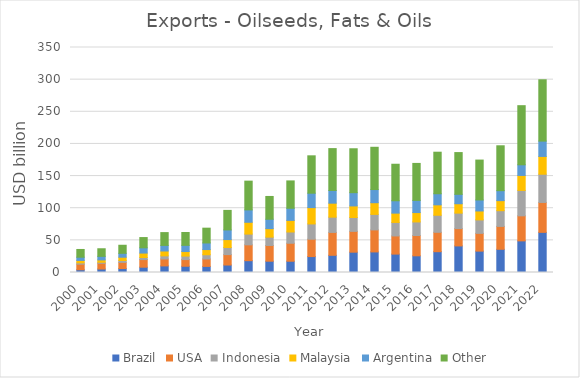
| Category | Brazil | USA | Indonesia | Malaysia | Argentina | Other  |
|---|---|---|---|---|---|---|
| 2000.0 | 4313.46 | 8647.464 | 1991.258 | 3811.366 | 5017.016 | 12046.791 |
| 2001.0 | 5423.744 | 8865.923 | 1622.854 | 3634.511 | 5551.077 | 11828.121 |
| 2002.0 | 6127.06 | 9622.836 | 2878.549 | 5140.683 | 6038.408 | 12564.76 |
| 2003.0 | 8254.503 | 11869.117 | 3233.716 | 6878.37 | 8181.266 | 15932.516 |
| 2004.0 | 10263.632 | 10770.296 | 4851.097 | 7565.911 | 8675.043 | 19948.678 |
| 2005.0 | 9714.659 | 10396.567 | 5408.635 | 7094.351 | 9611.067 | 20009.438 |
| 2006.0 | 9506.624 | 11518.924 | 6579.324 | 8075.714 | 10286.724 | 22993.578 |
| 2007.0 | 11631.434 | 16210.956 | 11006.793 | 12351.674 | 15034.696 | 30368.21 |
| 2008.0 | 18389.779 | 24646.091 | 16723.913 | 18365.071 | 19273.305 | 44714.136 |
| 2009.0 | 17581.955 | 24463.98 | 12958.465 | 13210.068 | 14635.223 | 35435.487 |
| 2010.0 | 17526.328 | 27986.221 | 17491.578 | 18054.786 | 18857.367 | 42551.467 |
| 2011.0 | 24774.508 | 27038.377 | 23756.433 | 25375.816 | 22395.56 | 58155.268 |
| 2012.0 | 26754.772 | 35593.694 | 23731.303 | 21759.454 | 19776.534 | 65108.641 |
| 2013.0 | 31613.75 | 32381.457 | 21559.93 | 18016.872 | 20595.803 | 68310.978 |
| 2014.0 | 32021.421 | 34238.929 | 24123.329 | 18178.434 | 20479.2 | 65741.741 |
| 2015.0 | 28617.652 | 28256.22 | 20978.102 | 14509.288 | 19227.306 | 56814.015 |
| 2016.0 | 25957.385 | 31611.341 | 21076.864 | 14614.496 | 18910.49 | 57511.901 |
| 2017.0 | 32365.21 | 30184.059 | 26485.479 | 16219.409 | 17251.751 | 64624.023 |
| 2018.0 | 41349.431 | 26961.178 | 24055.558 | 14588.373 | 14643.877 | 64954.535 |
| 2019.0 | 33260.038 | 27626.546 | 20937.463 | 13899.681 | 17112.722 | 62054.809 |
| 2020.0 | 36109.122 | 35605.038 | 24428.372 | 15648.152 | 15497.538 | 69821.355 |
| 2021.0 | 49190.083 | 38952.107 | 39518.427 | 23313.307 | 16570.241 | 91954.917 |
| 2022.0 | 62453.169 | 46523.311 | 43889.214 | 27687.117 | 23850.799 | 95393.598 |